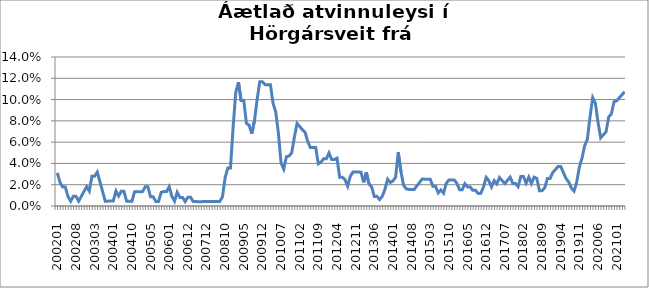
| Category | Series 0 |
|---|---|
| 200201 | 0.031 |
| 200202 | 0.022 |
| 200203 | 0.018 |
| 200204 | 0.018 |
| 200205 | 0.009 |
| 200206 | 0.004 |
| 200207 | 0.009 |
| 200208 | 0.009 |
| 200209 | 0.005 |
| 200210 | 0.009 |
| 200211 | 0.014 |
| 200212 | 0.018 |
| 200301 | 0.014 |
| 200302 | 0.028 |
| 200303 | 0.028 |
| 200304 | 0.032 |
| 200305 | 0.023 |
| 200306 | 0.014 |
| 200307 | 0.004 |
| 200311 | 0.005 |
| 200312 | 0.005 |
| 200401 | 0.005 |
| 200402 | 0.014 |
| 200403 | 0.009 |
| 200404 | 0.014 |
| 200405 | 0.014 |
| 200406 | 0.005 |
| 200409 | 0.004 |
| 200410 | 0.004 |
| 200411 | 0.013 |
| 200412 | 0.013 |
| 200501 | 0.013 |
| 200502 | 0.014 |
| 200503 | 0.018 |
| 200504 | 0.018 |
| 200505 | 0.009 |
| 200506 | 0.009 |
| 200507 | 0.004 |
| 200508 | 0.004 |
| 200510 | 0.013 |
| 200511 | 0.014 |
| 200512 | 0.014 |
| 200601 | 0.018 |
| 200602 | 0.009 |
| 200603 | 0.005 |
| 200606 | 0.013 |
| 200607 | 0.008 |
| 200608 | 0.008 |
| 200611 | 0.004 |
| 200612 | 0.008 |
| 200701 | 0.008 |
| 200702 | 0.004 |
| 200703 | 0.004 |
| 200704 | 0.004 |
| 200706 | 0.004 |
| 200711 | 0.004 |
| 200712 | 0.004 |
| 200801 | 0.004 |
| 200802 | 0.004 |
| 200803 | 0.004 |
| 200807 | 0.004 |
| 200808 | 0.004 |
| 200809 | 0.009 |
| 200810 | 0.027 |
| 200811 | 0.036 |
| 200812 | 0.036 |
| 200901 | 0.074 |
| 200902 | 0.107 |
| 200903 | 0.116 |
| 200904 | 0.099 |
| 200905 | 0.099 |
| 200906 | 0.078 |
| 200907 | 0.076 |
| 200908 | 0.068 |
| 200909 | 0.08 |
| 200910 | 0.1 |
| 200911 | 0.117 |
| 200912 | 0.117 |
| 201001 | 0.114 |
| 201002 | 0.114 |
| 201003 | 0.114 |
| 201004 | 0.096 |
| 201005 | 0.088 |
| 201006 | 0.068 |
| 201007 | 0.04 |
| 201008 | 0.035 |
| 201009 | 0.046 |
| 201010 | 0.047 |
| 201011 | 0.05 |
| 201012 | 0.065 |
| 201101 | 0.078 |
| 201102 | 0.075 |
| 201103 | 0.072 |
| 201104 | 0.069 |
| 201105 | 0.061 |
| 201106 | 0.055 |
| 201107 | 0.055 |
| 201108 | 0.055 |
| 201109 | 0.04 |
| 201110 | 0.041 |
| 201111 | 0.044 |
| 201112 | 0.044 |
| 201201 | 0.05 |
| 201202 | 0.044 |
| 201203 | 0.044 |
| 201204 | 0.045 |
| 201205 | 0.027 |
| 201206 | 0.027 |
| 201207 | 0.025 |
| 201208 | 0.019 |
| 201209 | 0.028 |
| 201210 | 0.032 |
| 201211 | 0.032 |
| 201212 | 0.032 |
| 201301 | 0.032 |
| 201302 | 0.022 |
| 201303 | 0.032 |
| 201304 | 0.021 |
| 201305 | 0.018 |
| 201306 | 0.009 |
| 201307 | 0.009 |
| 201308 | 0.006 |
| 201309 | 0.009 |
| 201310 | 0.016 |
| 201311 | 0.025 |
| 201312 | 0.022 |
| 201401 | 0.024 |
| 201402 | 0.027 |
| 201403 | 0.051 |
| 201404 | 0.032 |
| 201405 | 0.019 |
| 201406 | 0.016 |
| 201407 | 0.016 |
| 201408 | 0.016 |
| 201409 | 0.016 |
| 201410 | 0.019 |
| 201411 | 0.022 |
| 201412 | 0.025 |
| 201501 | 0.025 |
| 201502 | 0.025 |
| 201503 | 0.025 |
| 201504 | 0.018 |
| 201505 | 0.018 |
| 201506 | 0.012 |
| 201507 | 0.015 |
| 201508 | 0.012 |
| 201509 | 0.021 |
| 201510 | 0.025 |
| 201511 | 0.025 |
| 201512 | 0.025 |
| 201601 | 0.021 |
| 201602 | 0.015 |
| 201603 | 0.015 |
| 201604 | 0.021 |
| 201605 | 0.018 |
| 201606 | 0.018 |
| 201607 | 0.015 |
| 201608 | 0.015 |
| 201609 | 0.012 |
| 201610 | 0.012 |
| 201611 | 0.018 |
| 201612 | 0.027 |
| 201701 | 0.024 |
| 201702 | 0.018 |
| 201703 | 0.024 |
| 201704 | 0.021 |
| 201705 | 0.027 |
| 201706 | 0.024 |
| 201707 | 0.021 |
| 201708 | 0.024 |
| 201709 | 0.027 |
| 201710 | 0.021 |
| 201711 | 0.021 |
| 201712 | 0.018 |
| 201801 | 0.028 |
| 201802 | 0.028 |
| 201803 | 0.021 |
| 201804 | 0.027 |
| 201805 | 0.021 |
| 201806 | 0.027 |
| 201807 | 0.026 |
| 201808 | 0.014 |
| 201809 | 0.014 |
| 201810 | 0.017 |
| 201811 | 0.026 |
| 201812 | 0.026 |
| 201901 | 0.031 |
| 201902 | 0.034 |
| 201903 | 0.037 |
| 201904 | 0.037 |
| 201905 | 0.031 |
| 201906 | 0.026 |
| 201907 | 0.022 |
| 201908 | 0.017 |
| 201909 | 0.014 |
| 201910 | 0.023 |
| 201911 | 0.037 |
| 201912 | 0.045 |
| 202001 | 0.057 |
| 202002 | 0.063 |
| 202003 | 0.084 |
| 202004 | 0.102 |
| 202005 | 0.097 |
| 202006 | 0.079 |
| 202007 | 0.064 |
| 202008 | 0.067 |
| 202009 | 0.07 |
| 202010 | 0.084 |
| 202011 | 0.086 |
| 202012 | 0.098 |
| 202101 | 0.099 |
| 202102 | 0.102 |
| 202103 | 0.105 |
| 202104 | 0.107 |